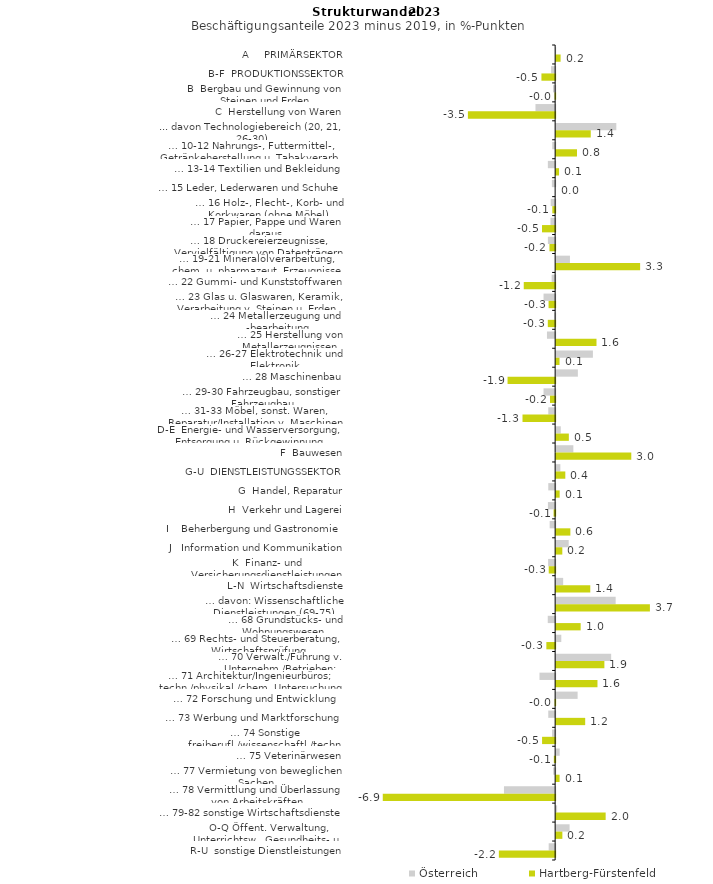
| Category | Österreich | Hartberg-Fürstenfeld |
|---|---|---|
| A     PRIMÄRSEKTOR | -0.007 | 0.177 |
| B-F  PRODUKTIONSSEKTOR | -0.161 | -0.545 |
| B  Bergbau und Gewinnung von Steinen und Erden | -0.086 | -0.024 |
| C  Herstellung von Waren | -0.782 | -3.47 |
| ... davon Technologiebereich (20, 21, 26-30) | 2.393 | 1.376 |
| … 10-12 Nahrungs-, Futtermittel-, Getränkeherstellung u. Tabakverarb. | -0.116 | 0.829 |
| … 13-14 Textilien und Bekleidung | -0.289 | 0.115 |
| … 15 Leder, Lederwaren und Schuhe | -0.13 | 0 |
| … 16 Holz-, Flecht-, Korb- und Korkwaren (ohne Möbel)  | -0.177 | -0.112 |
| … 17 Papier, Pappe und Waren daraus  | -0.185 | -0.522 |
| … 18 Druckereierzeugnisse, Vervielfältigung von Datenträgern | -0.288 | -0.226 |
| … 19-21 Mineralölverarbeitung, chem. u. pharmazeut. Erzeugnisse | 0.549 | 3.34 |
| … 22 Gummi- und Kunststoffwaren | -0.139 | -1.249 |
| … 23 Glas u. Glaswaren, Keramik, Verarbeitung v. Steinen u. Erden  | -0.462 | -0.262 |
| … 24 Metallerzeugung und -bearbeitung | -0.032 | -0.292 |
| … 25 Herstellung von Metallerzeugnissen  | -0.325 | 1.605 |
| … 26-27 Elektrotechnik und Elektronik | 1.462 | 0.134 |
| … 28 Maschinenbau | 0.864 | -1.893 |
| … 29-30 Fahrzeugbau, sonstiger Fahrzeugbau | -0.462 | -0.205 |
| … 31-33 Möbel, sonst. Waren, Reparatur/Installation v. Maschinen | -0.273 | -1.298 |
| D-E  Energie- und Wasserversorgung, Entsorgung u. Rückgewinnung | 0.184 | 0.505 |
| F  Bauwesen | 0.684 | 2.989 |
| G-U  DIENSTLEISTUNGSSEKTOR | 0.167 | 0.365 |
| G  Handel, Reparatur | -0.273 | 0.14 |
| H  Verkehr und Lagerei | -0.287 | -0.062 |
| I    Beherbergung und Gastronomie | -0.218 | 0.566 |
| J   Information und Kommunikation | 0.499 | 0.245 |
| K  Finanz- und Versicherungsdienstleistungen | -0.279 | -0.255 |
| L-N  Wirtschaftsdienste | 0.279 | 1.358 |
| … davon: Wissenschaftliche Dienstleistungen (69-75) | 2.367 | 3.729 |
| … 68 Grundstücks- und Wohnungswesen  | -0.294 | 0.975 |
| … 69 Rechts- und Steuerberatung, Wirtschaftsprüfung | 0.205 | -0.349 |
| … 70 Verwalt./Führung v. Unternehm./Betrieben; Unternehmensberat. | 2.188 | 1.919 |
| … 71 Architektur/Ingenieurbüros; techn./physikal./chem. Untersuchung | -0.622 | 1.644 |
| … 72 Forschung und Entwicklung  | 0.854 | -0.022 |
| … 73 Werbung und Marktforschung | -0.273 | 1.155 |
| … 74 Sonstige freiberufl./wissenschaftl./techn. Tätigkeiten | -0.124 | -0.52 |
| … 75 Veterinärwesen | 0.14 | -0.052 |
| … 77 Vermietung von beweglichen Sachen  | -0.077 | 0.137 |
| … 78 Vermittlung und Überlassung von Arbeitskräften | -2.035 | -6.856 |
| … 79-82 sonstige Wirtschaftsdienste | 0.039 | 1.969 |
| O-Q Öffent. Verwaltung, Unterrichtsw., Gesundheits- u. Sozialwesen | 0.535 | 0.247 |
| R-U  sonstige Dienstleistungen | -0.256 | -2.238 |